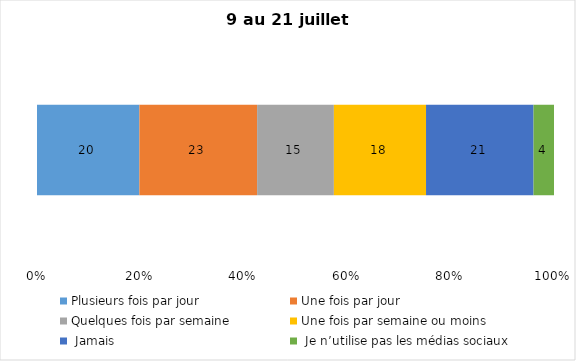
| Category | Plusieurs fois par jour | Une fois par jour | Quelques fois par semaine   | Une fois par semaine ou moins   |  Jamais   |  Je n’utilise pas les médias sociaux |
|---|---|---|---|---|---|---|
| 0 | 20 | 23 | 15 | 18 | 21 | 4 |